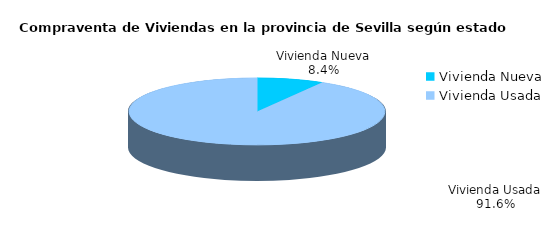
| Category | Series 0 | Series 1 |
|---|---|---|
| Vivienda Nueva | 130 | 0.084 |
| Vivienda Usada | 1419 | 0.916 |